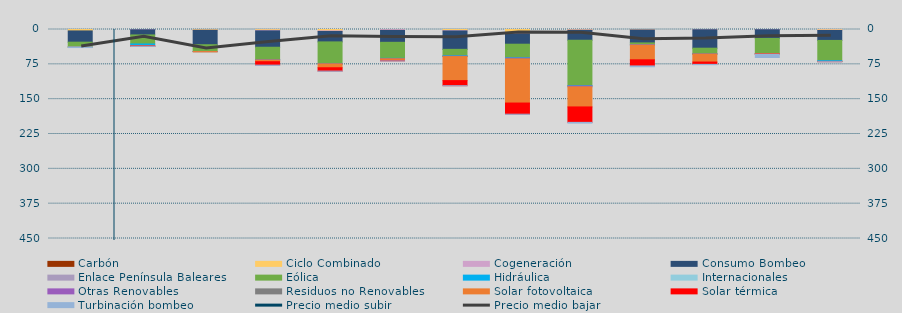
| Category | Carbón | Ciclo Combinado | Cogeneración | Consumo Bombeo | Enlace Península Baleares | Eólica | Hidráulica | Internacionales | Otras Renovables | Residuos no Renovables | Solar fotovoltaica | Solar térmica | Turbinación bombeo |
|---|---|---|---|---|---|---|---|---|---|---|---|---|---|
| 0 | 0 | 3059.067 | 0 | 24243.492 | 0 | 10425.232 | 13.796 | 0 | 0 | 0 | 9.194 | 0 | 1113.3 |
| 1 | 0 | 0 | 655.675 | 11045.084 | 0 | 19430.531 | 3297.137 | 0 | 1221.2 | 4.575 | 380.934 | 279.19 | 100 |
| 2 | 0 | 1578.425 | 97.391 | 31105.358 | 0 | 14760.555 | 0.525 | 0 | 6.9 | 0 | 610.128 | 0 | 0 |
| 3 | 0 | 1682.35 | 1288.318 | 35237.998 | 0 | 26715.501 | 538.936 | 0 | 327.466 | 97.457 | 3459.795 | 7401.339 | 450.583 |
| 4 | 0 | 2896.525 | 1320.794 | 22481.384 | 0 | 46423.207 | 245.293 | 0 | 655.227 | 248.362 | 8080.179 | 7222.305 | 292.5 |
| 5 | 0 | 199.85 | 1687.618 | 25714.166 | 0 | 34475.114 | 354.461 | 0 | 851.955 | 108.267 | 3215.484 | 949.057 | 183.208 |
| 6 | 0 | 2332.325 | 837.542 | 39583.668 | 0 | 13865.681 | 874.017 | 0 | 764.251 | 122.4 | 51660.192 | 10959.39 | 140 |
| 7 | 0 | 8570.193 | 1044.542 | 22062.469 | 0 | 29099.06 | 778.521 | 0 | 1951.311 | 135.5 | 94698.2 | 24041.497 | 242.133 |
| 8 | 0 | 898.7 | 918.519 | 21253.542 | 0 | 97910.858 | 671.55 | 0 | 1839.655 | 0 | 43222.778 | 33235.192 | 1586.933 |
| 9 | 0 | 958.3 | 215.177 | 27683.021 | 0 | 3999.405 | 139.925 | 0 | 560.625 | 0 | 31670.609 | 13214.049 | 1776.567 |
| 10 | 0 | 186.85 | 413.567 | 39689.899 | 0 | 12288.729 | 55.808 | 0 | 97.266 | 235.032 | 17134.015 | 4971.407 | 695.217 |
| 11 | 0 | 3.75 | 528.098 | 18641.496 | 0 | 32691.319 | 287.654 | 0 | 22.882 | 0 | 968.157 | 287.639 | 6902.5 |
| 12 | 0 | 1374.075 | 765.468 | 21378.15 | 0 | 43680.326 | 1412.165 | 0 | 335.383 | 0 | 163.086 | 136.883 | 470.8 |